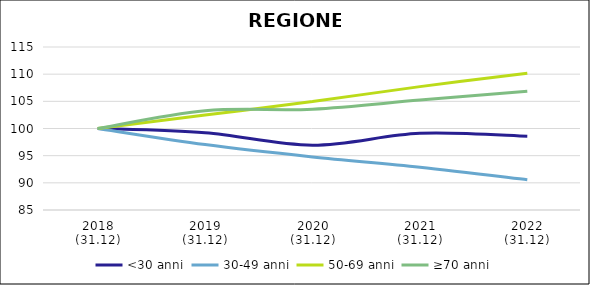
| Category | <30 anni | 30-49 anni | 50-69 anni | ≥70 anni |
|---|---|---|---|---|
| 2018
(31.12) | 100 | 100 | 100 | 100 |
| 2019
(31.12) | 99.217 | 97.043 | 102.478 | 103.272 |
| 2020
(31.12) | 96.929 | 94.77 | 104.958 | 103.565 |
| 2021
(31.12) | 99.11 | 92.883 | 107.709 | 105.234 |
| 2022
(31.12) | 98.575 | 90.56 | 110.178 | 106.877 |